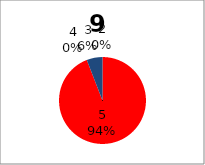
| Category | Series 0 |
|---|---|
| 5.0 | 16 |
| 4.0 | 0 |
| 3.0 | 1 |
| 2.0 | 0 |